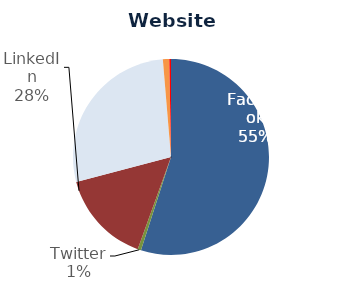
| Category | Website Referrals |
|---|---|
| Facebook | 12345 |
| Twitter | 125 |
| YouTube | 3456 |
| LinkedIn | 6236 |
| Google+ | 236 |
| Pinterest | 62 |
| Foursquare | 0 |